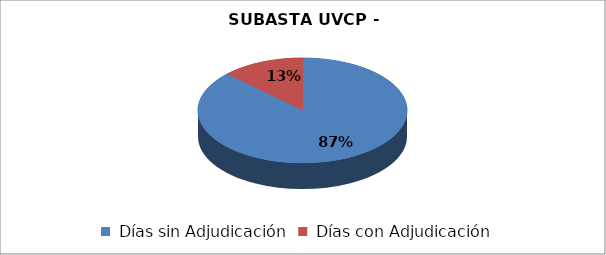
| Category | Series 0 |
|---|---|
| Días sin Adjudicación | 300 |
| Días con Adjudicación | 44 |